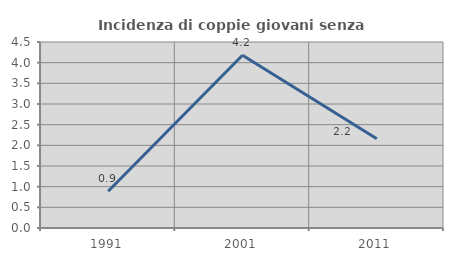
| Category | Incidenza di coppie giovani senza figli |
|---|---|
| 1991.0 | 0.888 |
| 2001.0 | 4.18 |
| 2011.0 | 2.158 |